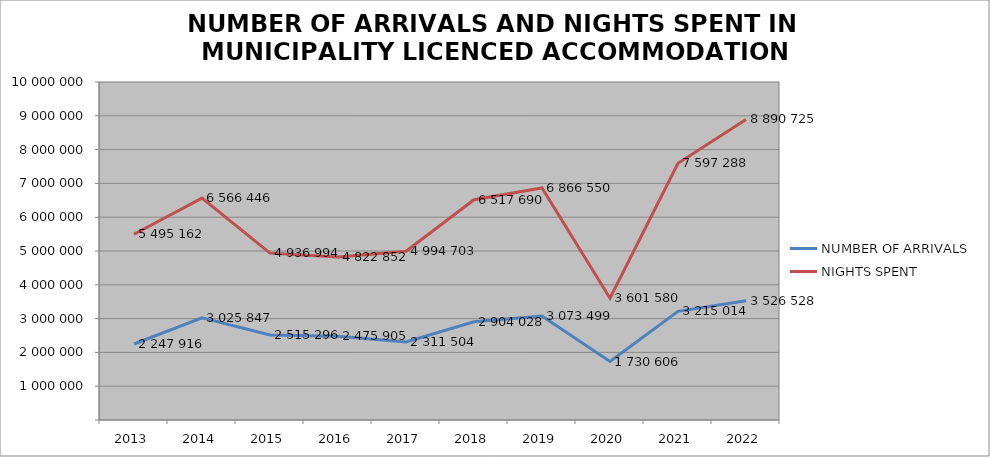
| Category | NUMBER OF ARRIVALS | NIGHTS SPENT |
|---|---|---|
| 2013 | 2247916 | 5495162 |
| 2014 | 3025847 | 6566446 |
| 2015 | 2515296 | 4936994 |
| 2016 | 2475905 | 4822852 |
| 2017 | 2311504 | 4994703 |
| 2018 | 2904028 | 6517690 |
| 2019 | 3073499 | 6866550 |
| 2020 | 1730606 | 3601580 |
| 2021 | 3215014 | 7597288 |
| 2022 | 3526528 | 8890725 |